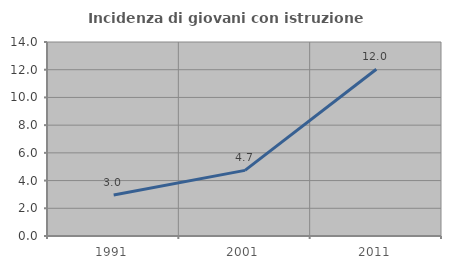
| Category | Incidenza di giovani con istruzione universitaria |
|---|---|
| 1991.0 | 2.959 |
| 2001.0 | 4.737 |
| 2011.0 | 12.03 |